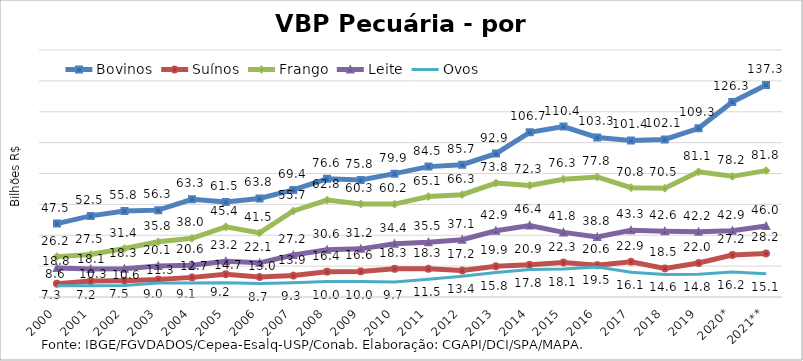
| Category | Bovinos | Suínos | Frango | Leite | Ovos |
|---|---|---|---|---|---|
| 2000 | 47.531 | 8.606 | 26.154 | 18.774 | 7.341 |
| 2001 | 52.541 | 10.325 | 27.49 | 18.066 | 7.234 |
| 2002 | 55.756 | 10.582 | 31.379 | 18.293 | 7.453 |
| 2003 | 56.272 | 11.31 | 35.774 | 20.145 | 9.015 |
| 2004 | 63.313 | 12.716 | 37.988 | 20.589 | 9.137 |
| 2005 | 61.468 | 14.743 | 45.417 | 23.157 | 9.199 |
| 2006 | 63.819 | 12.968 | 41.49 | 22.119 | 8.738 |
| 2007 | 69.356 | 13.867 | 55.746 | 27.192 | 9.286 |
| 2008 | 76.577 | 16.42 | 62.752 | 30.589 | 10.029 |
| 2009 | 75.778 | 16.598 | 60.251 | 31.186 | 10 |
| 2010 | 79.893 | 18.26 | 60.178 | 34.441 | 9.726 |
| 2011 | 84.46 | 18.288 | 65.086 | 35.504 | 11.461 |
| 2012 | 85.719 | 17.172 | 66.3 | 37.1 | 13.435 |
| 2013 | 92.889 | 19.882 | 73.793 | 42.933 | 15.801 |
| 2014 | 106.712 | 20.883 | 72.301 | 46.361 | 17.753 |
| 2015 | 110.385 | 22.317 | 76.327 | 41.849 | 18.076 |
| 2016 | 103.325 | 20.596 | 77.772 | 38.831 | 19.487 |
| 2017 | 101.396 | 22.863 | 70.837 | 43.266 | 16.062 |
| 2018 | 102.075 | 18.516 | 70.451 | 42.623 | 14.606 |
| 2019 | 109.3 | 22.008 | 81.117 | 42.228 | 14.792 |
| 2020* | 126.321 | 27.231 | 78.156 | 42.934 | 16.185 |
| 2021** | 137.299 | 28.191 | 81.849 | 46.022 | 15.14 |